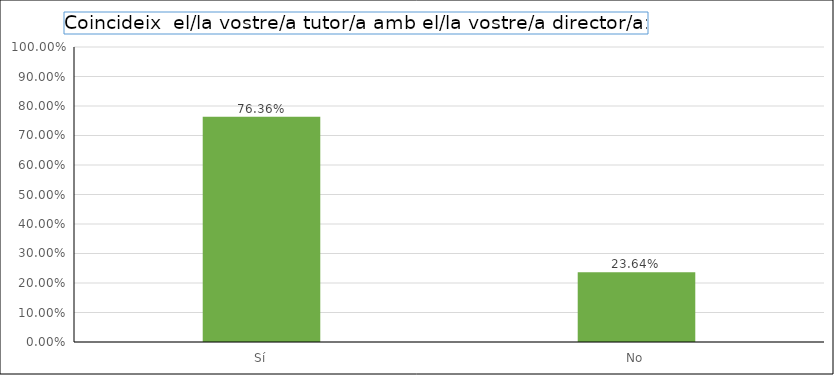
| Category | Series 0 |
|---|---|
| Sí | 0.764 |
| No | 0.236 |